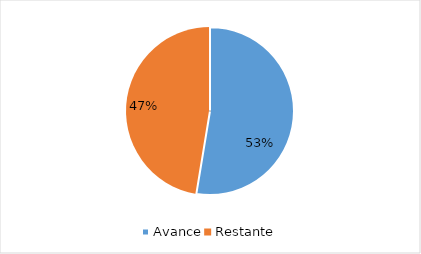
| Category | Series 0 |
|---|---|
| Avance | 0.526 |
| Restante | 0.474 |